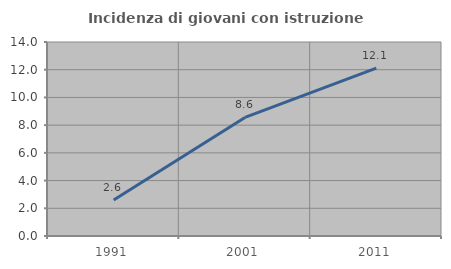
| Category | Incidenza di giovani con istruzione universitaria |
|---|---|
| 1991.0 | 2.597 |
| 2001.0 | 8.556 |
| 2011.0 | 12.121 |